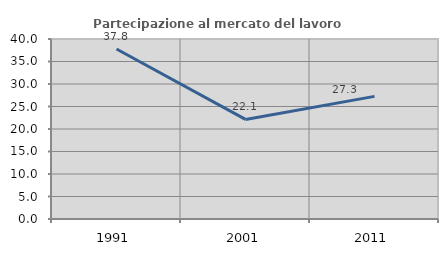
| Category | Partecipazione al mercato del lavoro  femminile |
|---|---|
| 1991.0 | 37.789 |
| 2001.0 | 22.127 |
| 2011.0 | 27.25 |